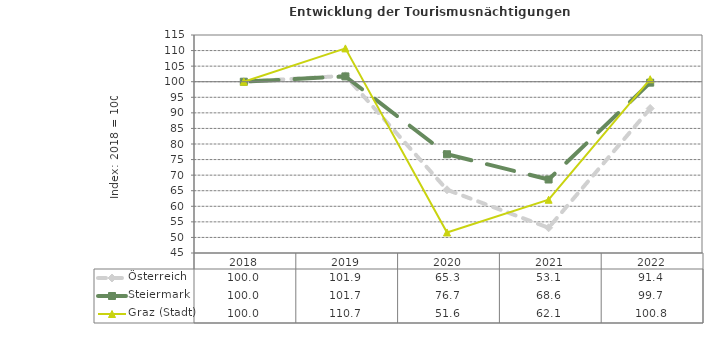
| Category | Österreich | Steiermark | Graz (Stadt) |
|---|---|---|---|
| 2022.0 | 91.4 | 99.7 | 100.8 |
| 2021.0 | 53.1 | 68.6 | 62.1 |
| 2020.0 | 65.3 | 76.7 | 51.6 |
| 2019.0 | 101.9 | 101.7 | 110.7 |
| 2018.0 | 100 | 100 | 100 |